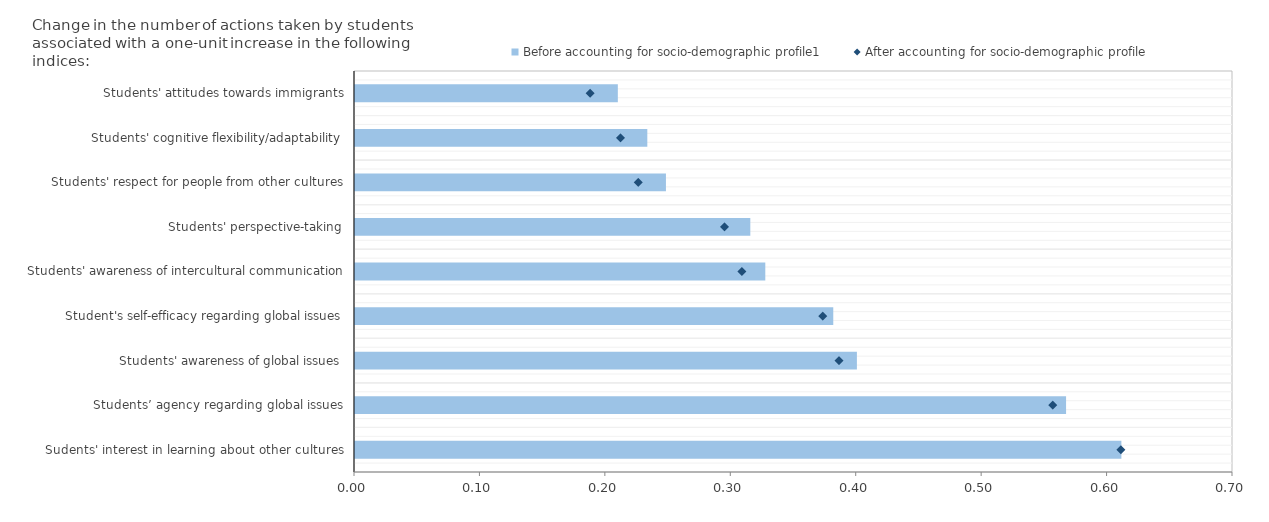
| Category | Before accounting for socio-demographic profile1 |
|---|---|
| Sudents' interest in learning about other cultures | 0.611 |
| Students’ agency regarding global issues | 0.567 |
| Students' awareness of global issues | 0.4 |
| Student's self-efficacy regarding global issues | 0.381 |
| Students' awareness of intercultural communication | 0.327 |
| Students' perspective-taking | 0.315 |
| Students' respect for people from other cultures | 0.248 |
| Students' cognitive flexibility/adaptability | 0.233 |
| Students' attitudes towards immigrants | 0.21 |